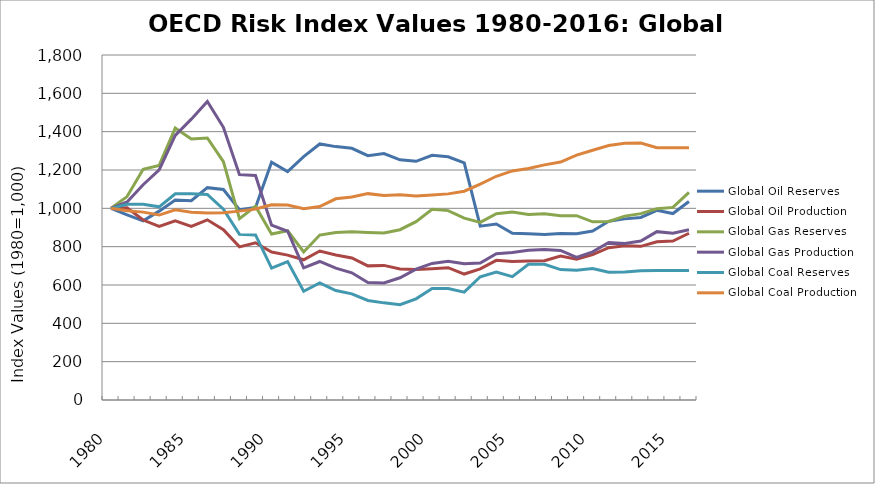
| Category | Global Oil Reserves | Global Oil Production | Global Gas Reserves | Global Gas Production | Global Coal Reserves | Global Coal Production |
|---|---|---|---|---|---|---|
| 1980.0 | 1000 | 1000 | 1000 | 1000 | 1000 | 1000 |
| 1981.0 | 965.465 | 1002.368 | 1061.25 | 1033.541 | 1021.331 | 987.492 |
| 1982.0 | 934.486 | 938.943 | 1203.595 | 1123.277 | 1021.331 | 980.255 |
| 1983.0 | 985.373 | 905.244 | 1223.929 | 1200.28 | 1007.745 | 964.882 |
| 1984.0 | 1043.55 | 934.363 | 1418.458 | 1380.3 | 1076.143 | 992.653 |
| 1985.0 | 1040.004 | 905.533 | 1361.797 | 1465.387 | 1075.445 | 979.772 |
| 1986.0 | 1107.889 | 939.924 | 1367.253 | 1557.938 | 1072.57 | 975.838 |
| 1987.0 | 1098.24 | 888.26 | 1243.378 | 1422.752 | 995.882 | 977.359 |
| 1988.0 | 992.666 | 799.114 | 945.698 | 1175.646 | 864.047 | 985.42 |
| 1989.0 | 1004.92 | 820.107 | 1010.798 | 1171.301 | 861.073 | 996.53 |
| 1990.0 | 1240.745 | 771.686 | 866.048 | 911.942 | 687.845 | 1018.588 |
| 1991.0 | 1191.842 | 755.855 | 883.51 | 880.546 | 722.39 | 1017.632 |
| 1992.0 | 1269.859 | 731.478 | 772.175 | 689.206 | 567.096 | 998.357 |
| 1993.0 | 1335.884 | 777.472 | 860.491 | 722.681 | 611.243 | 1009.2 |
| 1994.0 | 1322.037 | 756.91 | 874.171 | 688.149 | 570.867 | 1049.704 |
| 1995.0 | 1313.092 | 741.34 | 877.261 | 663.442 | 553.645 | 1059.091 |
| 1996.0 | 1274.601 | 699.786 | 874.18 | 612.889 | 519.51 | 1076.663 |
| 1997.0 | 1286.075 | 702.245 | 871.796 | 610.624 | 506.793 | 1067.017 |
| 1998.0 | 1253.217 | 683.195 | 888.487 | 637.709 | 497.547 | 1070.865 |
| 1999.0 | 1245.484 | 681.144 | 930.389 | 682.828 | 527.787 | 1064.961 |
| 2000.0 | 1276.84 | 685.337 | 994.976 | 712.384 | 582.103 | 1069.407 |
| 2001.0 | 1269.021 | 690.381 | 988.124 | 724.373 | 581.296 | 1075.451 |
| 2002.0 | 1237.625 | 657.113 | 948.981 | 710.91 | 562.595 | 1089.427 |
| 2003.0 | 906.84 | 683.862 | 926.424 | 714.853 | 643.121 | 1126.1 |
| 2004.0 | 918.554 | 728.538 | 972.338 | 763.098 | 667.039 | 1167.283 |
| 2005.0 | 870.3 | 722.655 | 980.612 | 769.092 | 643.67 | 1195.302 |
| 2006.0 | 867.265 | 725.726 | 968.288 | 781.091 | 708.039 | 1207.588 |
| 2007.0 | 863.253 | 727.002 | 971.145 | 785.804 | 707.721 | 1226.698 |
| 2008.0 | 868.298 | 750.859 | 961.568 | 780.512 | 680.27 | 1241.345 |
| 2009.0 | 867.609 | 734.042 | 961.475 | 743.551 | 677.153 | 1277.333 |
| 2010.0 | 881.86 | 758.507 | 929.393 | 773.146 | 685.862 | 1302.772 |
| 2011.0 | 932.239 | 794.923 | 931.502 | 821.493 | 666.78 | 1327.859 |
| 2012.0 | 945.017 | 804.688 | 959.274 | 816.306 | 667.643 | 1339.691 |
| 2013.0 | 952.33 | 801.743 | 972.25 | 829.03 | 674.27 | 1340.784 |
| 2014.0 | 989.827 | 825.268 | 998.037 | 878.411 | 675.015 | 1316.738 |
| 2015.0 | 972.819 | 829.651 | 1004.764 | 870.171 | 675.125 | 1316.738 |
| 2016.0 | 1035.978 | 869.992 | 1083.229 | 887.874 | 675.125 | 1316.738 |